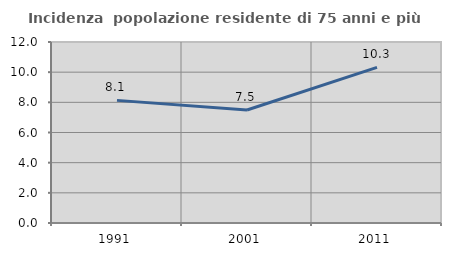
| Category | Incidenza  popolazione residente di 75 anni e più |
|---|---|
| 1991.0 | 8.13 |
| 2001.0 | 7.488 |
| 2011.0 | 10.317 |